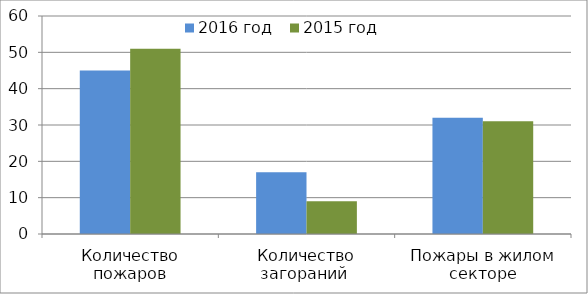
| Category | 2016 год | 2015 год |
|---|---|---|
| Количество пожаров | 45 | 51 |
| Количество загораний  | 17 | 9 |
| Пожары в жилом секторе | 32 | 31 |